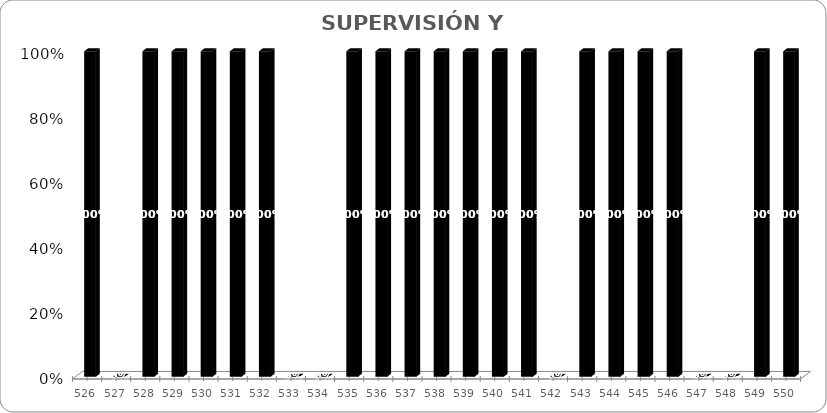
| Category | Series 0 |
|---|---|
| 526.0 | 1 |
| 527.0 | 0 |
| 528.0 | 1 |
| 529.0 | 1 |
| 530.0 | 1 |
| 531.0 | 1 |
| 532.0 | 1 |
| 533.0 | 0 |
| 534.0 | 0 |
| 535.0 | 1 |
| 536.0 | 1 |
| 537.0 | 1 |
| 538.0 | 1 |
| 539.0 | 1 |
| 540.0 | 1 |
| 541.0 | 1 |
| 542.0 | 0 |
| 543.0 | 1 |
| 544.0 | 1 |
| 545.0 | 1 |
| 546.0 | 1 |
| 547.0 | 0 |
| 548.0 | 0 |
| 549.0 | 1 |
| 550.0 | 1 |